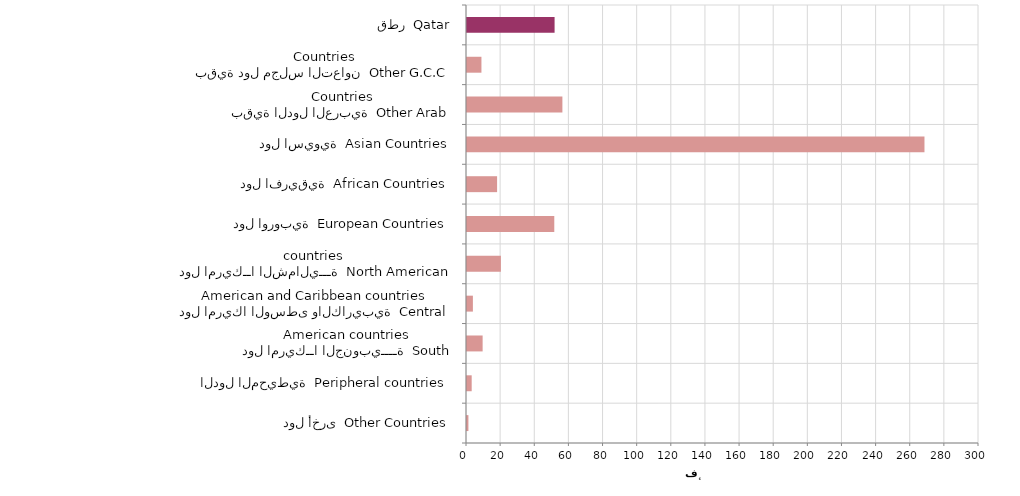
| Category | Series 0 |
|---|---|
| دول أخرى  Other Countries | 830 |
| الدول المحيطية  Peripheral countries | 2748 |
| دول امريكــا الجنوبيــــة  South American countries | 9158 |
| دول امريكا الوسطى والكاريبية  Central American and Caribbean countries | 3456 |
| دول امريكــا الشماليـــة  North American countries  | 19868 |
| دول اوروبية  European Countries | 51144 |
| دول افريقية  African Countries | 17630 |
| دول اسيوية  Asian Countries | 268051 |
| بقية الدول العربية  Other Arab Countries | 55893 |
| بقية دول مجلس التعاون  Other G.C.C Countries | 8460 |
| قطر  Qatar | 51320 |